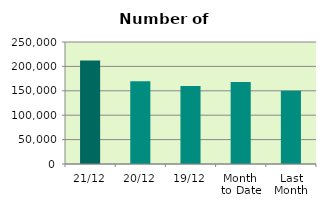
| Category | Series 0 |
|---|---|
| 21/12 | 212106 |
| 20/12 | 169494 |
| 19/12 | 160024 |
| Month 
to Date | 167952.667 |
| Last
Month | 150008.364 |